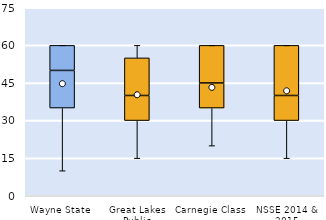
| Category | 25th | 50th | 75th |
|---|---|---|---|
| Wayne State | 35 | 15 | 10 |
| Great Lakes Public | 30 | 10 | 15 |
| Carnegie Class | 35 | 10 | 15 |
| NSSE 2014 & 2015 | 30 | 10 | 20 |